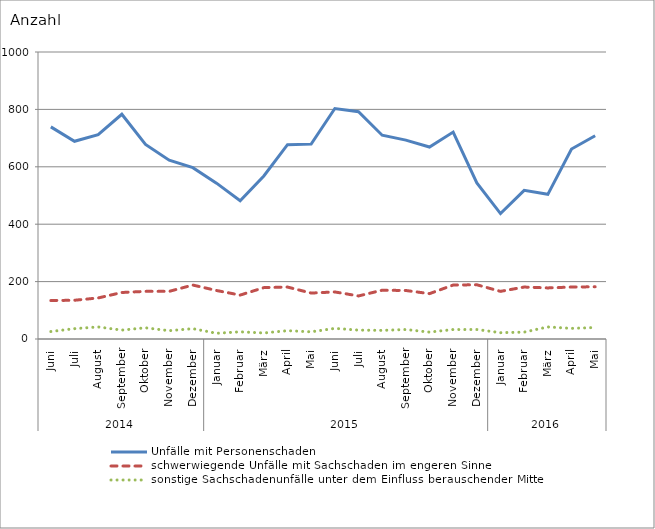
| Category | Unfälle mit Personenschaden | schwerwiegende Unfälle mit Sachschaden im engeren Sinne | sonstige Sachschadenunfälle unter dem Einfluss berauschender Mittel |
|---|---|---|---|
| 0 | 739 | 134 | 26 |
| 1 | 689 | 135 | 36 |
| 2 | 712 | 143 | 42 |
| 3 | 783 | 162 | 31 |
| 4 | 678 | 166 | 39 |
| 5 | 623 | 166 | 29 |
| 6 | 597 | 188 | 36 |
| 7 | 543 | 169 | 20 |
| 8 | 482 | 153 | 25 |
| 9 | 568 | 179 | 21 |
| 10 | 677 | 181 | 29 |
| 11 | 679 | 160 | 25 |
| 12 | 803 | 164 | 37 |
| 13 | 792 | 150 | 31 |
| 14 | 710 | 170 | 30 |
| 15 | 693 | 169 | 33 |
| 16 | 669 | 158 | 24 |
| 17 | 721 | 188 | 33 |
| 18 | 544 | 189 | 33 |
| 19 | 437 | 166 | 22 |
| 20 | 518 | 181 | 24 |
| 21 | 504 | 178 | 42 |
| 22 | 662 | 181 | 37 |
| 23 | 708 | 182 | 40 |